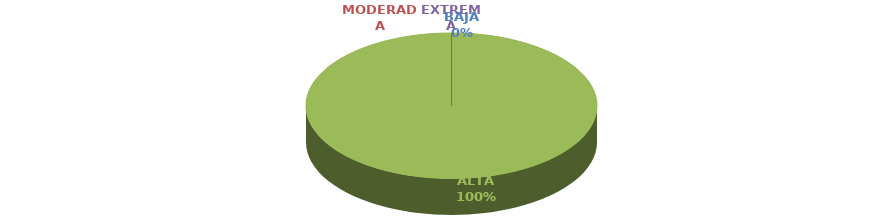
| Category | DISTRIBUCIÓN ZONA RIESGOS INHERENTES |
|---|---|
| BAJA | 0 |
| MODERADA | 0 |
| ALTA | 19 |
| EXTREMA | 0 |